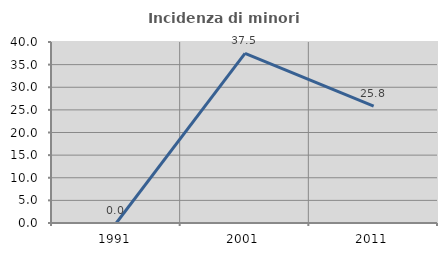
| Category | Incidenza di minori stranieri |
|---|---|
| 1991.0 | 0 |
| 2001.0 | 37.5 |
| 2011.0 | 25.806 |